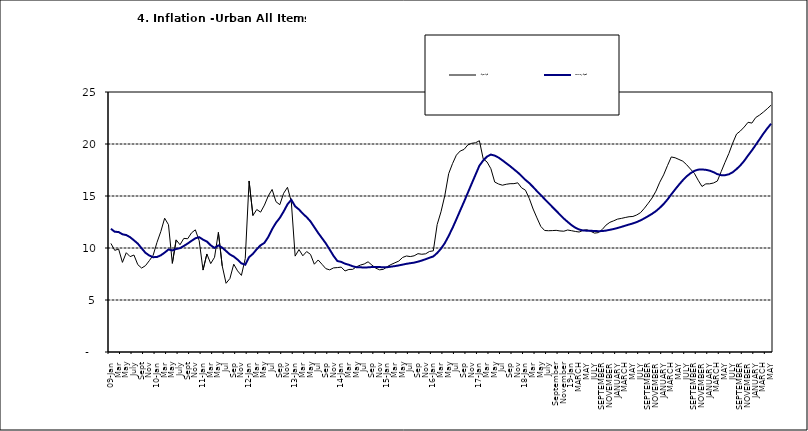
| Category | Year-on Rate | 12-Month Average |
|---|---|---|
| 09-Jan | 10.439 | 11.844 |
| Feb | 9.772 | 11.562 |
| Mar | 9.907 | 11.538 |
| Apr | 8.618 | 11.319 |
| May | 9.547 | 11.246 |
| June | 9.17 | 11.039 |
| July | 9.325 | 10.738 |
| Aug | 8.401 | 10.424 |
| Sept | 8.07 | 9.973 |
| Oct | 8.3 | 9.535 |
| Nov | 8.781 | 9.278 |
| Dec | 9.298 | 9.117 |
| 10-Jan | 10.534 | 9.136 |
| Feb | 11.584 | 9.297 |
| Mar | 12.864 | 9.555 |
| Apr | 12.24 | 9.859 |
| May | 8.524 | 9.769 |
| June | 10.781 | 9.904 |
| July | 10.313 | 9.987 |
| Aug | 10.924 | 10.197 |
| Sept | 10.891 | 10.43 |
| Oct | 11.457 | 10.689 |
| Nov | 11.748 | 10.932 |
| Dec | 10.699 | 11.042 |
| 11-Jan | 7.878 | 10.806 |
| Feb | 9.426 | 10.623 |
| Mar | 8.498 | 10.26 |
| Apr | 9.11 | 10.005 |
| May | 11.5 | 10.249 |
| Jun | 8.278 | 10.034 |
| Jul | 6.608 | 9.711 |
| Aug | 7.061 | 9.38 |
| Sep | 8.443 | 9.178 |
| Oct | 7.802 | 8.88 |
| Nov | 7.365 | 8.525 |
| Dec | 8.993 | 8.395 |
| 12-Jan | 16.445 | 9.119 |
| Feb | 13.123 | 9.443 |
| Mar | 13.701 | 9.889 |
| Apr | 13.447 | 10.259 |
| May | 14.127 | 10.496 |
| Jun | 15.012 | 11.062 |
| Jul | 15.63 | 11.81 |
| Aug | 14.456 | 12.422 |
| Sep | 14.162 | 12.893 |
| Oct | 15.26 | 13.506 |
| Nov | 15.836 | 14.199 |
| Dec | 14.459 | 14.637 |
| 13-Jan | 9.22 | 14.006 |
| Feb | 9.85 | 13.703 |
| Mar | 9.253 | 13.302 |
| Apr | 9.657 | 12.966 |
| May | 9.385 | 12.557 |
| Jun | 8.441 | 11.999 |
| Jul | 8.849 | 11.443 |
| Aug | 8.431 | 10.946 |
| Sep | 8.013 | 10.44 |
| Oct | 7.9 | 9.849 |
| Nov | 8.086 | 9.245 |
| Dec | 8.117 | 8.75 |
| 14-Jan | 8.164 | 8.662 |
| Feb | 7.791 | 8.493 |
| Mar | 7.937 | 8.384 |
| Apr | 7.947 | 8.246 |
| May | 8.195 | 8.151 |
| Jun | 8.358 | 8.146 |
| Jul | 8.464 | 8.118 |
| Aug | 8.673 | 8.141 |
| Sep | 8.357 | 8.17 |
| Oct | 8.064 | 8.182 |
| Nov | 7.902 | 8.165 |
| Dec | 7.948 | 8.151 |
| 15-Jan | 8.211 | 8.155 |
| Feb | 8.412 | 8.206 |
| Mar | 8.579 | 8.26 |
| Apr | 8.742 | 8.326 |
| May | 9.092 | 8.403 |
| Jun | 9.232 | 8.478 |
| Jul | 9.177 | 8.54 |
| Aug | 9.25 | 8.591 |
| Sep | 9.455 | 8.684 |
| Oct | 9.398 | 8.795 |
| Nov | 9.442 | 8.922 |
| Dec | 9.665 | 9.064 |
| 16-Jan | 9.728 | 9.19 |
| Feb | 12.254 | 9.516 |
| Mar | 13.485 | 9.935 |
| Apr | 15.052 | 10.474 |
| May | 17.148 | 11.165 |
| Jun | 18.111 | 11.925 |
| Jul | 18.927 | 12.754 |
| Aug | 19.325 | 13.605 |
| Sep | 19.476 | 14.444 |
| Oct | 19.914 | 15.318 |
| Nov | 20.067 | 16.193 |
| Dec | 20.118 | 17.05 |
| 17-Jan | 20.315 | 17.914 |
| Feb | 18.569 | 18.418 |
| Mar | 18.27 | 18.794 |
| Apr | 17.621 | 18.982 |
| May | 16.343 | 18.883 |
| Jun | 16.153 | 18.692 |
| Jul | 16.038 | 18.43 |
| Aug | 16.128 | 18.151 |
| Sep | 16.183 | 17.872 |
| Oct | 16.187 | 17.567 |
| Nov | 16.267 | 17.264 |
| Dec | 15.785 | 16.921 |
| 18-Jan | 15.559 | 16.55 |
| Feb | 14.763 | 16.241 |
| Mar | 13.748 | 15.866 |
| Apr | 12.893 | 15.468 |
| May | 12.077 | 15.096 |
| June | 11.683 | 14.706 |
| July | 11.661 | 14.329 |
| August | 11.673 | 13.951 |
| September | 11.697 | 13.578 |
| October | 11.64 | 13.206 |
| November | 11.615 | 12.831 |
| December | 11.731 | 12.509 |
| 19-Jan | 11.664 | 12.203 |
| February | 11.592 | 11.954 |
| MARCH | 11.535 | 11.78 |
| APRIL | 11.696 | 11.686 |
| MAY | 11.756 | 11.662 |
| JUNE | 11.605 | 11.655 |
| JULY | 11.432 | 11.635 |
| AUGUST | 11.479 | 11.618 |
| SEPTEMBER | 11.776 | 11.626 |
| OCTOBER | 12.202 | 11.676 |
| NOVEMBER | 12.469 | 11.75 |
| DECEMBER | 12.617 | 11.827 |
| JANUARY | 12.779 | 11.923 |
| FEBRUARY | 12.847 | 12.03 |
| MARCH | 12.932 | 12.147 |
| APRIL | 13.008 | 12.258 |
| MAY | 13.033 | 12.365 |
| JUNE | 13.178 | 12.496 |
| JULY | 13.403 | 12.659 |
| AUGUST | 13.827 | 12.855 |
| SEPTEMBER | 14.306 | 13.068 |
| OCTOBER | 14.811 | 13.289 |
| NOVEMBER | 15.466 | 13.546 |
| DECEMBER | 16.327 | 13.864 |
| JANUARY | 17.03 | 14.228 |
| FEBRUARY | 17.918 | 14.66 |
| MARCH | 18.756 | 15.154 |
| APRIL | 18.675 | 15.63 |
| MAY | 18.514 | 16.086 |
| JUNE | 18.348 | 16.512 |
| JULY | 18.007 | 16.886 |
| AUGUST | 17.59 | 17.187 |
| SEPTEMBER | 17.187 | 17.411 |
| OCTOBER | 16.52 | 17.534 |
| NOVEMBER | 15.916 | 17.55 |
| DECEMBER | 16.165 | 17.519 |
| JANUARY | 16.171 | 17.435 |
| FEBRUARY | 16.253 | 17.292 |
| MARCH | 16.438 | 17.103 |
| APRIL | 17.347 | 17.005 |
| MAY | 18.24 | 17.002 |
| JUNE | 19.093 | 17.087 |
| JULY | 20.087 | 17.285 |
| AUGUST | 20.954 | 17.588 |
| SEPTEMBER | 21.251 | 17.944 |
| OCTOBER | 21.632 | 18.379 |
| NOVEMBER | 22.086 | 18.896 |
| DECEMBER | 22.011 | 19.382 |
| JANUARY | 22.548 | 19.912 |
| FEBRUARY | 22.782 | 20.451 |
| MARCH | 23.072 | 20.998 |
| APRIL | 23.392 | 21.496 |
| MAY | 23.736 | 21.949 |